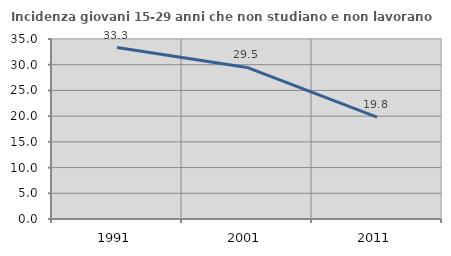
| Category | Incidenza giovani 15-29 anni che non studiano e non lavorano  |
|---|---|
| 1991.0 | 33.333 |
| 2001.0 | 29.472 |
| 2011.0 | 19.802 |